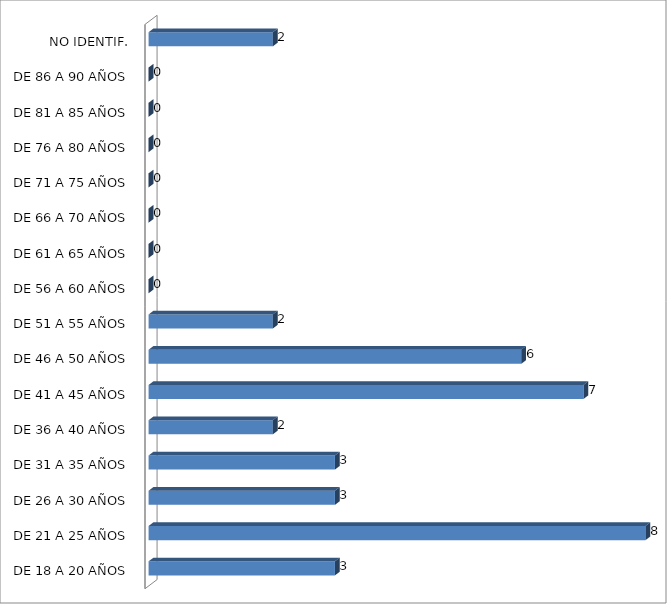
| Category | ESTADO  DE EBRIEDAD |
|---|---|
| DE 18 A 20 AÑOS | 3 |
| DE 21 A 25 AÑOS | 8 |
| DE 26 A 30 AÑOS | 3 |
| DE 31 A 35 AÑOS | 3 |
| DE 36 A 40 AÑOS | 2 |
| DE 41 A 45 AÑOS | 7 |
| DE 46 A 50 AÑOS | 6 |
| DE 51 A 55 AÑOS | 2 |
| DE 56 A 60 AÑOS | 0 |
| DE 61 A 65 AÑOS | 0 |
| DE 66 A 70 AÑOS | 0 |
| DE 71 A 75 AÑOS | 0 |
| DE 76 A 80 AÑOS | 0 |
| DE 81 A 85 AÑOS | 0 |
| DE 86 A 90 AÑOS | 0 |
| NO IDENTIF. | 2 |